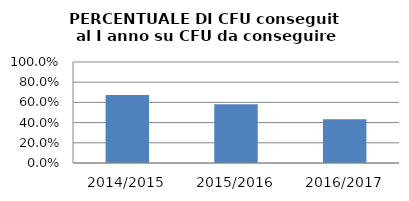
| Category | 2014/2015 2015/2016 2016/2017 |
|---|---|
| 2014/2015 | 0.674 |
| 2015/2016 | 0.582 |
| 2016/2017 | 0.432 |